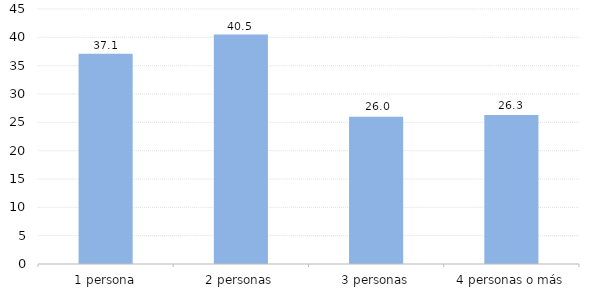
| Category | LA RIOJA |
|---|---|
| 1 persona | 37.1 |
| 2 personas | 40.5 |
| 3 personas | 26 |
| 4 personas o más | 26.3 |